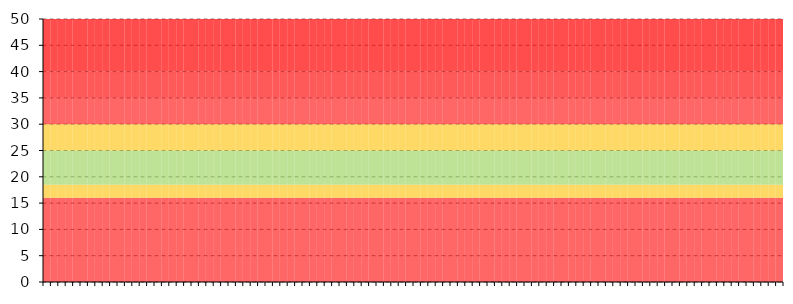
| Category | Series 1 | Series 2 | Series 3 | Series 4 | Series 5 | Series 6 | Series 7 |
|---|---|---|---|---|---|---|---|
| 0 | 16 | 2.5 | 6.5 | 5 | 5 | 5 | 10 |
| 1900-01-01 | 16 | 2.5 | 6.5 | 5 | 5 | 5 | 10 |
| 1900-01-02 | 16 | 2.5 | 6.5 | 5 | 5 | 5 | 10 |
| 1900-01-03 | 16 | 2.5 | 6.5 | 5 | 5 | 5 | 10 |
| 1900-01-04 | 16 | 2.5 | 6.5 | 5 | 5 | 5 | 10 |
| 1900-01-05 | 16 | 2.5 | 6.5 | 5 | 5 | 5 | 10 |
| 1900-01-06 | 16 | 2.5 | 6.5 | 5 | 5 | 5 | 10 |
| 1900-01-07 | 16 | 2.5 | 6.5 | 5 | 5 | 5 | 10 |
| 1900-01-08 | 16 | 2.5 | 6.5 | 5 | 5 | 5 | 10 |
| 1900-01-09 | 16 | 2.5 | 6.5 | 5 | 5 | 5 | 10 |
| 1900-01-10 | 16 | 2.5 | 6.5 | 5 | 5 | 5 | 10 |
| 1900-01-11 | 16 | 2.5 | 6.5 | 5 | 5 | 5 | 10 |
| 1900-01-12 | 16 | 2.5 | 6.5 | 5 | 5 | 5 | 10 |
| 1900-01-13 | 16 | 2.5 | 6.5 | 5 | 5 | 5 | 10 |
| 1900-01-14 | 16 | 2.5 | 6.5 | 5 | 5 | 5 | 10 |
| 1900-01-15 | 16 | 2.5 | 6.5 | 5 | 5 | 5 | 10 |
| 1900-01-16 | 16 | 2.5 | 6.5 | 5 | 5 | 5 | 10 |
| 1900-01-17 | 16 | 2.5 | 6.5 | 5 | 5 | 5 | 10 |
| 1900-01-18 | 16 | 2.5 | 6.5 | 5 | 5 | 5 | 10 |
| 1900-01-19 | 16 | 2.5 | 6.5 | 5 | 5 | 5 | 10 |
| 1900-01-20 | 16 | 2.5 | 6.5 | 5 | 5 | 5 | 10 |
| 1900-01-21 | 16 | 2.5 | 6.5 | 5 | 5 | 5 | 10 |
| 1900-01-22 | 16 | 2.5 | 6.5 | 5 | 5 | 5 | 10 |
| 1900-01-23 | 16 | 2.5 | 6.5 | 5 | 5 | 5 | 10 |
| 1900-01-24 | 16 | 2.5 | 6.5 | 5 | 5 | 5 | 10 |
| 1900-01-25 | 16 | 2.5 | 6.5 | 5 | 5 | 5 | 10 |
| 1900-01-26 | 16 | 2.5 | 6.5 | 5 | 5 | 5 | 10 |
| 1900-01-27 | 16 | 2.5 | 6.5 | 5 | 5 | 5 | 10 |
| 1900-01-28 | 16 | 2.5 | 6.5 | 5 | 5 | 5 | 10 |
| 1900-01-29 | 16 | 2.5 | 6.5 | 5 | 5 | 5 | 10 |
| 1900-01-30 | 16 | 2.5 | 6.5 | 5 | 5 | 5 | 10 |
| 1900-01-31 | 16 | 2.5 | 6.5 | 5 | 5 | 5 | 10 |
| 1900-02-01 | 16 | 2.5 | 6.5 | 5 | 5 | 5 | 10 |
| 1900-02-02 | 16 | 2.5 | 6.5 | 5 | 5 | 5 | 10 |
| 1900-02-03 | 16 | 2.5 | 6.5 | 5 | 5 | 5 | 10 |
| 1900-02-04 | 16 | 2.5 | 6.5 | 5 | 5 | 5 | 10 |
| 1900-02-05 | 16 | 2.5 | 6.5 | 5 | 5 | 5 | 10 |
| 1900-02-06 | 16 | 2.5 | 6.5 | 5 | 5 | 5 | 10 |
| 1900-02-07 | 16 | 2.5 | 6.5 | 5 | 5 | 5 | 10 |
| 1900-02-08 | 16 | 2.5 | 6.5 | 5 | 5 | 5 | 10 |
| 1900-02-09 | 16 | 2.5 | 6.5 | 5 | 5 | 5 | 10 |
| 1900-02-10 | 16 | 2.5 | 6.5 | 5 | 5 | 5 | 10 |
| 1900-02-11 | 16 | 2.5 | 6.5 | 5 | 5 | 5 | 10 |
| 1900-02-12 | 16 | 2.5 | 6.5 | 5 | 5 | 5 | 10 |
| 1900-02-13 | 16 | 2.5 | 6.5 | 5 | 5 | 5 | 10 |
| 1900-02-14 | 16 | 2.5 | 6.5 | 5 | 5 | 5 | 10 |
| 1900-02-15 | 16 | 2.5 | 6.5 | 5 | 5 | 5 | 10 |
| 1900-02-16 | 16 | 2.5 | 6.5 | 5 | 5 | 5 | 10 |
| 1900-02-17 | 16 | 2.5 | 6.5 | 5 | 5 | 5 | 10 |
| 1900-02-18 | 16 | 2.5 | 6.5 | 5 | 5 | 5 | 10 |
| 1900-02-19 | 16 | 2.5 | 6.5 | 5 | 5 | 5 | 10 |
| 1900-02-20 | 16 | 2.5 | 6.5 | 5 | 5 | 5 | 10 |
| 1900-02-21 | 16 | 2.5 | 6.5 | 5 | 5 | 5 | 10 |
| 1900-02-22 | 16 | 2.5 | 6.5 | 5 | 5 | 5 | 10 |
| 1900-02-23 | 16 | 2.5 | 6.5 | 5 | 5 | 5 | 10 |
| 1900-02-24 | 16 | 2.5 | 6.5 | 5 | 5 | 5 | 10 |
| 1900-02-25 | 16 | 2.5 | 6.5 | 5 | 5 | 5 | 10 |
| 1900-02-26 | 16 | 2.5 | 6.5 | 5 | 5 | 5 | 10 |
| 1900-02-27 | 16 | 2.5 | 6.5 | 5 | 5 | 5 | 10 |
| 1900-02-28 | 16 | 2.5 | 6.5 | 5 | 5 | 5 | 10 |
| 1900-02-28 | 16 | 2.5 | 6.5 | 5 | 5 | 5 | 10 |
| 1900-03-01 | 16 | 2.5 | 6.5 | 5 | 5 | 5 | 10 |
| 1900-03-02 | 16 | 2.5 | 6.5 | 5 | 5 | 5 | 10 |
| 1900-03-03 | 16 | 2.5 | 6.5 | 5 | 5 | 5 | 10 |
| 1900-03-04 | 16 | 2.5 | 6.5 | 5 | 5 | 5 | 10 |
| 1900-03-05 | 16 | 2.5 | 6.5 | 5 | 5 | 5 | 10 |
| 1900-03-06 | 16 | 2.5 | 6.5 | 5 | 5 | 5 | 10 |
| 1900-03-07 | 16 | 2.5 | 6.5 | 5 | 5 | 5 | 10 |
| 1900-03-08 | 16 | 2.5 | 6.5 | 5 | 5 | 5 | 10 |
| 1900-03-09 | 16 | 2.5 | 6.5 | 5 | 5 | 5 | 10 |
| 1900-03-10 | 16 | 2.5 | 6.5 | 5 | 5 | 5 | 10 |
| 1900-03-11 | 16 | 2.5 | 6.5 | 5 | 5 | 5 | 10 |
| 1900-03-12 | 16 | 2.5 | 6.5 | 5 | 5 | 5 | 10 |
| 1900-03-13 | 16 | 2.5 | 6.5 | 5 | 5 | 5 | 10 |
| 1900-03-14 | 16 | 2.5 | 6.5 | 5 | 5 | 5 | 10 |
| 1900-03-15 | 16 | 2.5 | 6.5 | 5 | 5 | 5 | 10 |
| 1900-03-16 | 16 | 2.5 | 6.5 | 5 | 5 | 5 | 10 |
| 1900-03-17 | 16 | 2.5 | 6.5 | 5 | 5 | 5 | 10 |
| 1900-03-18 | 16 | 2.5 | 6.5 | 5 | 5 | 5 | 10 |
| 1900-03-19 | 16 | 2.5 | 6.5 | 5 | 5 | 5 | 10 |
| 1900-03-20 | 16 | 2.5 | 6.5 | 5 | 5 | 5 | 10 |
| 1900-03-21 | 16 | 2.5 | 6.5 | 5 | 5 | 5 | 10 |
| 1900-03-22 | 16 | 2.5 | 6.5 | 5 | 5 | 5 | 10 |
| 1900-03-23 | 16 | 2.5 | 6.5 | 5 | 5 | 5 | 10 |
| 1900-03-24 | 16 | 2.5 | 6.5 | 5 | 5 | 5 | 10 |
| 1900-03-25 | 16 | 2.5 | 6.5 | 5 | 5 | 5 | 10 |
| 1900-03-26 | 16 | 2.5 | 6.5 | 5 | 5 | 5 | 10 |
| 1900-03-27 | 16 | 2.5 | 6.5 | 5 | 5 | 5 | 10 |
| 1900-03-28 | 16 | 2.5 | 6.5 | 5 | 5 | 5 | 10 |
| 1900-03-29 | 16 | 2.5 | 6.5 | 5 | 5 | 5 | 10 |
| 1900-03-30 | 16 | 2.5 | 6.5 | 5 | 5 | 5 | 10 |
| 1900-03-31 | 16 | 2.5 | 6.5 | 5 | 5 | 5 | 10 |
| 1900-04-01 | 16 | 2.5 | 6.5 | 5 | 5 | 5 | 10 |
| 1900-04-02 | 16 | 2.5 | 6.5 | 5 | 5 | 5 | 10 |
| 1900-04-03 | 16 | 2.5 | 6.5 | 5 | 5 | 5 | 10 |
| 1900-04-04 | 16 | 2.5 | 6.5 | 5 | 5 | 5 | 10 |
| 1900-04-05 | 16 | 2.5 | 6.5 | 5 | 5 | 5 | 10 |
| 1900-04-06 | 16 | 2.5 | 6.5 | 5 | 5 | 5 | 10 |
| 1900-04-07 | 16 | 2.5 | 6.5 | 5 | 5 | 5 | 10 |
| 1900-04-08 | 16 | 2.5 | 6.5 | 5 | 5 | 5 | 10 |